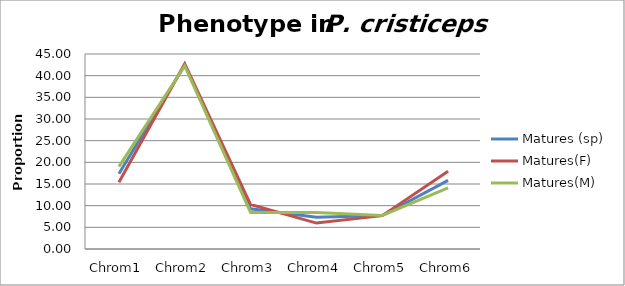
| Category | Matures (sp) | Matures(F)  | Matures(M) |
|---|---|---|---|
| Chrom1 | 17.375 | 15.385 | 19.014 |
| Chrom2 | 42.471 | 42.735 | 42.254 |
| Chrom3 | 9.266 | 10.256 | 8.451 |
| Chrom4 | 7.336 | 5.983 | 8.451 |
| Chrom5 | 7.722 | 7.692 | 7.746 |
| Chrom6 | 15.83 | 17.949 | 14.085 |